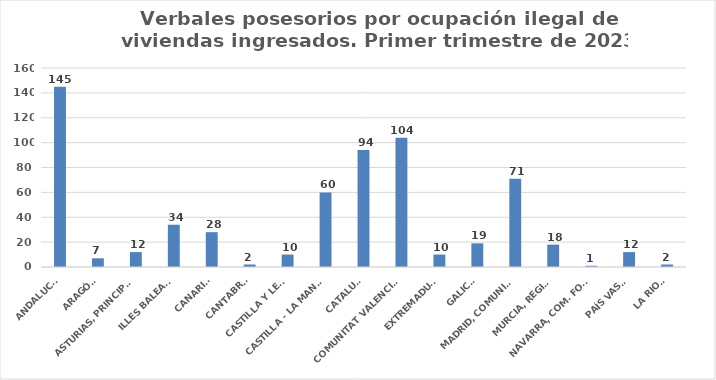
| Category | Series 0 |
|---|---|
| ANDALUCÍA | 145 |
| ARAGÓN | 7 |
| ASTURIAS, PRINCIPADO | 12 |
| ILLES BALEARS | 34 |
| CANARIAS | 28 |
| CANTABRIA | 2 |
| CASTILLA Y LEÓN | 10 |
| CASTILLA - LA MANCHA | 60 |
| CATALUÑA | 94 |
| COMUNITAT VALENCIANA | 104 |
| EXTREMADURA | 10 |
| GALICIA | 19 |
| MADRID, COMUNIDAD | 71 |
| MURCIA, REGIÓN | 18 |
| NAVARRA, COM. FORAL | 1 |
| PAÍS VASCO | 12 |
| LA RIOJA | 2 |